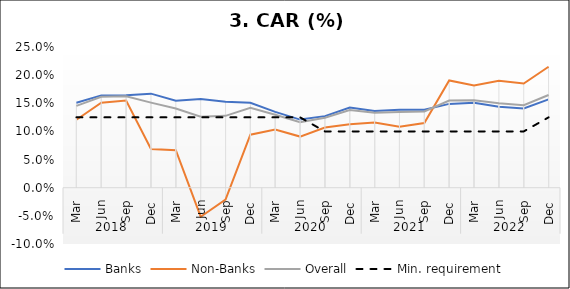
| Category | Banks | Non-Banks | Overall | Min. requirement |
|---|---|---|---|---|
| 0 | 0.151 | 0.121 | 0.145 | 0.125 |
| 1 | 0.164 | 0.151 | 0.162 | 0.125 |
| 2 | 0.164 | 0.155 | 0.163 | 0.125 |
| 3 | 0.167 | 0.069 | 0.151 | 0.125 |
| 4 | 0.155 | 0.067 | 0.141 | 0.125 |
| 5 | 0.158 | -0.051 | 0.126 | 0.125 |
| 6 | 0.153 | -0.021 | 0.128 | 0.125 |
| 7 | 0.151 | 0.094 | 0.142 | 0.125 |
| 8 | 0.135 | 0.103 | 0.13 | 0.125 |
| 9 | 0.121 | 0.091 | 0.116 | 0.125 |
| 10 | 0.127 | 0.107 | 0.124 | 0.1 |
| 11 | 0.142 | 0.113 | 0.138 | 0.1 |
| 12 | 0.136 | 0.116 | 0.133 | 0.1 |
| 13 | 0.139 | 0.109 | 0.134 | 0.1 |
| 14 | 0.139 | 0.115 | 0.136 | 0.1 |
| 15 | 0.149 | 0.191 | 0.155 | 0.1 |
| 16 | 0.151 | 0.182 | 0.156 | 0.1 |
| 17 | 0.144 | 0.19 | 0.15 | 0.1 |
| 18 | 0.141 | 0.185 | 0.147 | 0.1 |
| 19 | 0.157 | 0.215 | 0.165 | 0.125 |